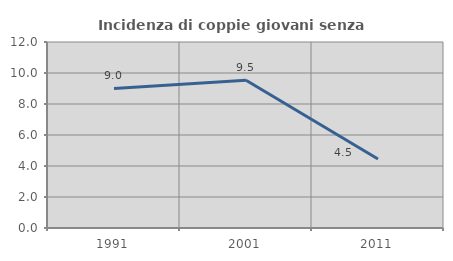
| Category | Incidenza di coppie giovani senza figli |
|---|---|
| 1991.0 | 9.005 |
| 2001.0 | 9.528 |
| 2011.0 | 4.45 |